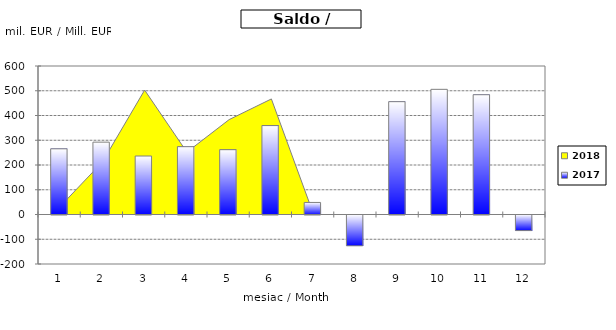
| Category | 2017 |
|---|---|
| 0 | 265.408 |
| 1 | 292.36 |
| 2 | 236.289 |
| 3 | 274.001 |
| 4 | 261.855 |
| 5 | 359.276 |
| 6 | 48.711 |
| 7 | -124.425 |
| 8 | 455.886 |
| 9 | 505.693 |
| 10 | 483.998 |
| 11 | -62.987 |